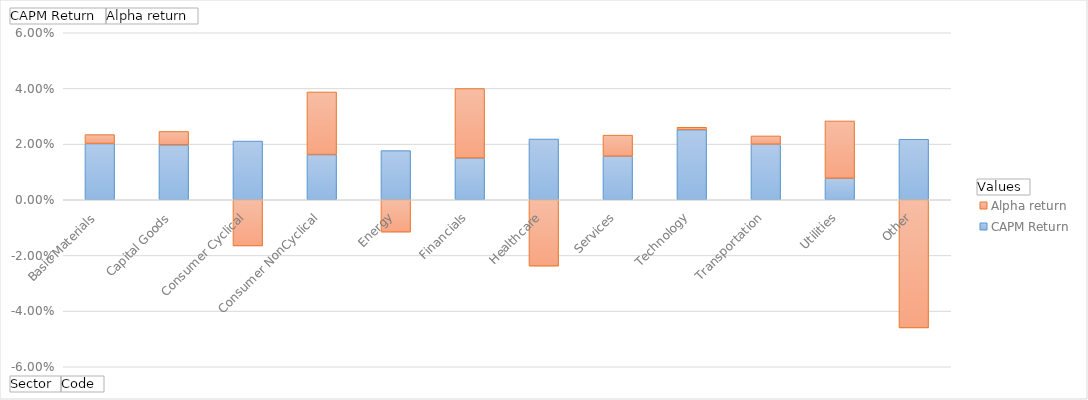
| Category | CAPM Return | Alpha return |
|---|---|---|
| Basic Materials | 0.02 | 0.003 |
| Capital Goods | 0.02 | 0.005 |
| Consumer Cyclical | 0.021 | -0.017 |
| Consumer NonCyclical | 0.016 | 0.023 |
| Energy | 0.018 | -0.012 |
| Financials | 0.015 | 0.025 |
| Healthcare | 0.022 | -0.024 |
| Services | 0.016 | 0.008 |
| Technology | 0.025 | 0.001 |
| Transportation | 0.02 | 0.003 |
| Utilities | 0.008 | 0.021 |
| Other | 0.022 | -0.046 |